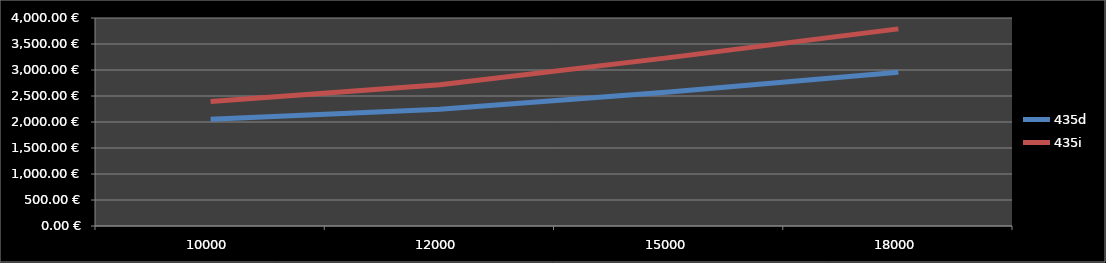
| Category | 435d | 435i |
|---|---|---|
| 10000.0 | 2054 | 2395 |
| 12000.0 | 2244.4 | 2717 |
| 15000.0 | 2579 | 3238 |
| 18000.0 | 2955.6 | 3791 |